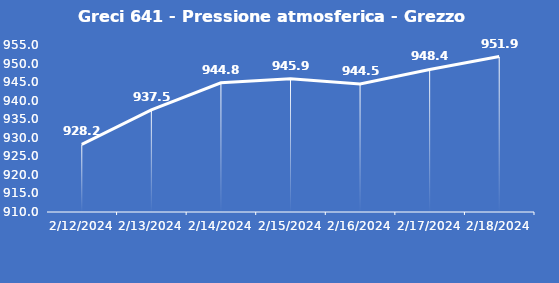
| Category | Greci 641 - Pressione atmosferica - Grezzo (hPa) |
|---|---|
| 2/12/24 | 928.2 |
| 2/13/24 | 937.5 |
| 2/14/24 | 944.8 |
| 2/15/24 | 945.9 |
| 2/16/24 | 944.5 |
| 2/17/24 | 948.4 |
| 2/18/24 | 951.9 |